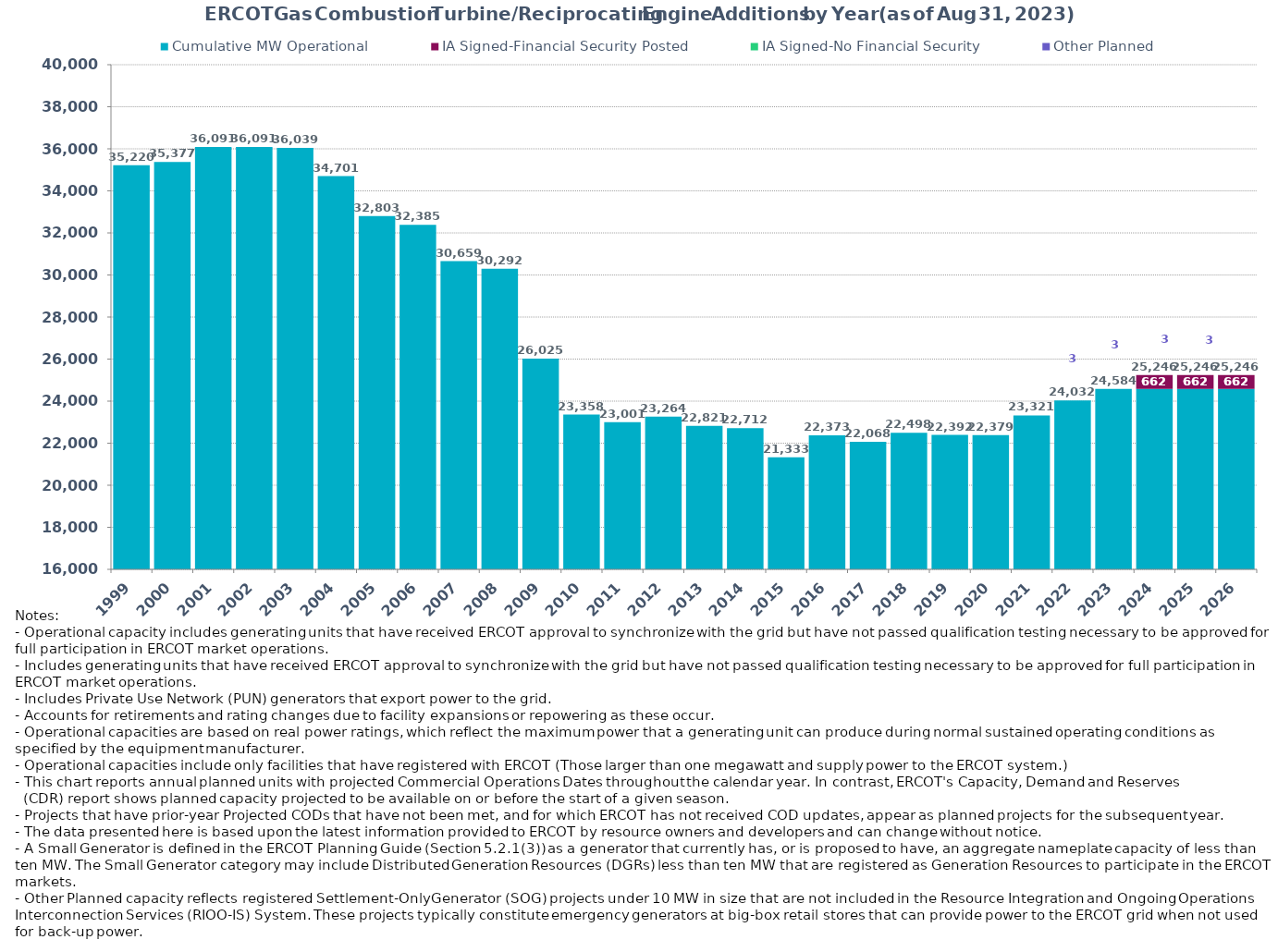
| Category | Cumulative MW Operational | IA Signed-Financial Security Posted | IA Signed-No Financial Security  | Other Planned | Cumulative Installed and Planned |
|---|---|---|---|---|---|
| 1999.0 | 35219.87 | 0 | 0 | 0 | 35219.87 |
| 2000.0 | 35377.48 | 0 | 0 | 0 | 35377.48 |
| 2001.0 | 36091.14 | 0 | 0 | 0 | 36091.14 |
| 2002.0 | 36091.14 | 0 | 0 | 0 | 36091.14 |
| 2003.0 | 36039.14 | 0 | 0 | 0 | 36039.14 |
| 2004.0 | 34701.24 | 0 | 0 | 0 | 34701.24 |
| 2005.0 | 32803.04 | 0 | 0 | 0 | 32803.04 |
| 2006.0 | 32385.14 | 0 | 0 | 0 | 32385.14 |
| 2007.0 | 30659.14 | 0 | 0 | 0 | 30659.14 |
| 2008.0 | 30291.94 | 0 | 0 | 0 | 30291.94 |
| 2009.0 | 26025.17 | 0 | 0 | 0 | 26025.17 |
| 2010.0 | 23358.05 | 0 | 0 | 0 | 23358.05 |
| 2011.0 | 23001.35 | 0 | 0 | 0 | 23001.35 |
| 2012.0 | 23263.55 | 0 | 0 | 0 | 23263.55 |
| 2013.0 | 22820.71 | 0 | 0 | 0 | 22820.71 |
| 2014.0 | 22711.71 | 0 | 0 | 0 | 22711.71 |
| 2015.0 | 21332.91 | 0 | 0 | 0 | 21332.91 |
| 2016.0 | 22373.29 | 0 | 0 | 0 | 22373.29 |
| 2017.0 | 22068.43 | 0 | 0 | 0 | 22068.43 |
| 2018.0 | 22497.59 | 0 | 0 | 0 | 22497.59 |
| 2019.0 | 22392.29 | 0 | 0 | 0 | 22392.29 |
| 2020.0 | 22379.29 | 0 | 0 | 0 | 22379.29 |
| 2021.0 | 23321.49 | 0 | 0 | 0 | 23321.49 |
| 2022.0 | 24031.64 | 0 | 0 | 0 | 24031.64 |
| 2023.0 | 24581.24 | 0 | 0 | 2.8 | 24584.04 |
| 2024.0 | 24581.24 | 662 | 0 | 2.8 | 25246.04 |
| 2025.0 | 24581.24 | 662 | 0 | 2.8 | 25246.04 |
| 2026.0 | 24581.24 | 662 | 0 | 2.8 | 25246.04 |